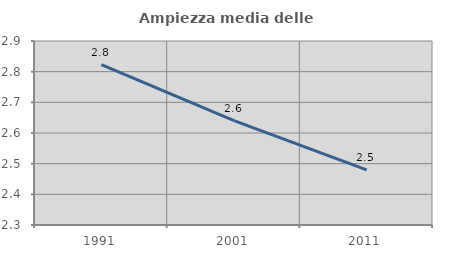
| Category | Ampiezza media delle famiglie |
|---|---|
| 1991.0 | 2.823 |
| 2001.0 | 2.64 |
| 2011.0 | 2.48 |